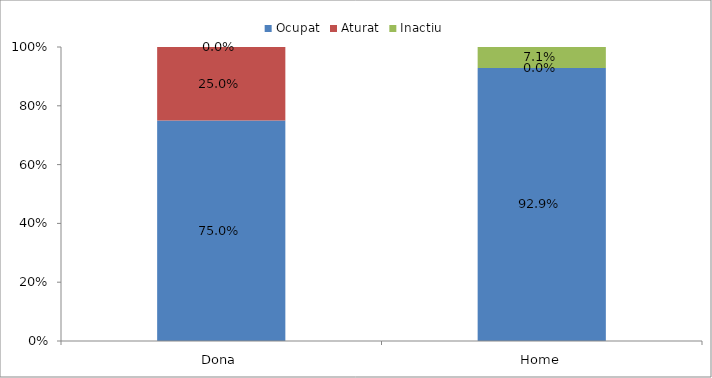
| Category | Ocupat | Aturat | Inactiu |
|---|---|---|---|
| Dona | 0.75 | 0.25 | 0 |
| Home | 0.929 | 0 | 0.071 |